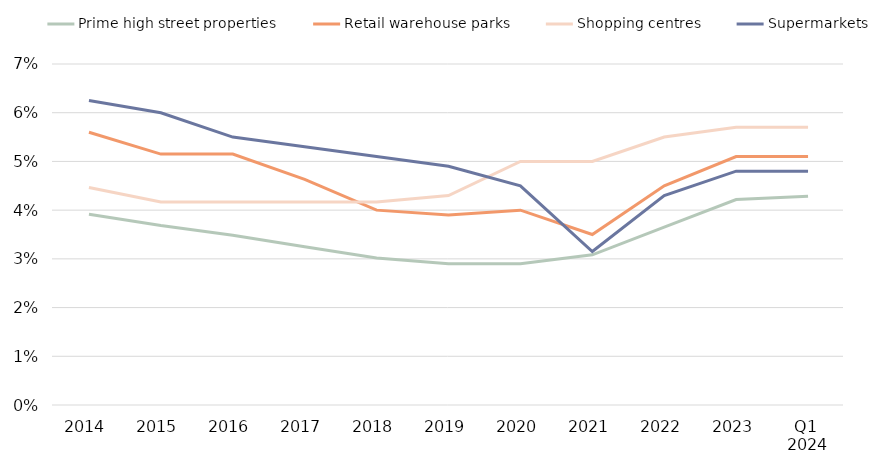
| Category | Prime high street properties | Retail warehouse parks | Shopping centres | Supermarkets |
|---|---|---|---|---|
| 2014 | 0.039 | 0.056 | 0.045 | 0.062 |
| 2015 | 0.037 | 0.052 | 0.042 | 0.06 |
| 2016 | 0.035 | 0.052 | 0.042 | 0.055 |
| 2017 | 0.032 | 0.046 | 0.042 | 0.053 |
| 2018 | 0.03 | 0.04 | 0.042 | 0.051 |
| 2019 | 0.029 | 0.039 | 0.043 | 0.049 |
| 2020 | 0.029 | 0.04 | 0.05 | 0.045 |
| 2021 | 0.031 | 0.035 | 0.05 | 0.032 |
| 2022 | 0.037 | 0.045 | 0.055 | 0.043 |
| 2023 | 0.042 | 0.051 | 0.057 | 0.048 |
| Q1 
2024 | 0.043 | 0.051 | 0.057 | 0.048 |